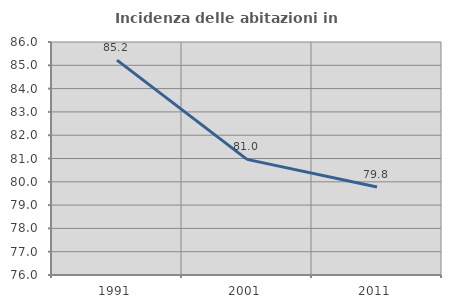
| Category | Incidenza delle abitazioni in proprietà  |
|---|---|
| 1991.0 | 85.224 |
| 2001.0 | 80.963 |
| 2011.0 | 79.78 |